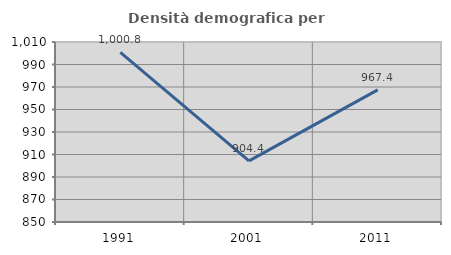
| Category | Densità demografica |
|---|---|
| 1991.0 | 1000.793 |
| 2001.0 | 904.383 |
| 2011.0 | 967.447 |